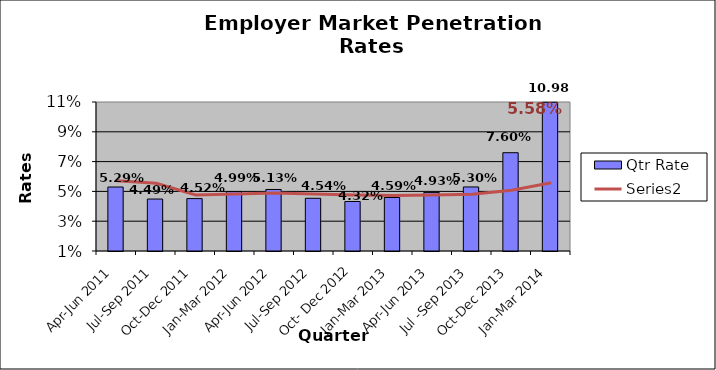
| Category | Qtr Rate |
|---|---|
| Apr-Jun 2011 | 0.053 |
| Jul-Sep 2011 | 0.045 |
| Oct-Dec 2011 | 0.045 |
| Jan-Mar 2012 | 0.05 |
| Apr-Jun 2012 | 0.051 |
| Jul-Sep 2012 | 0.045 |
| Oct- Dec 2012 | 0.043 |
| Jan-Mar 2013 | 0.046 |
| Apr-Jun 2013 | 0.049 |
| Jul -Sep 2013 | 0.053 |
| Oct-Dec 2013 | 0.076 |
| Jan-Mar 2014 | 0.11 |